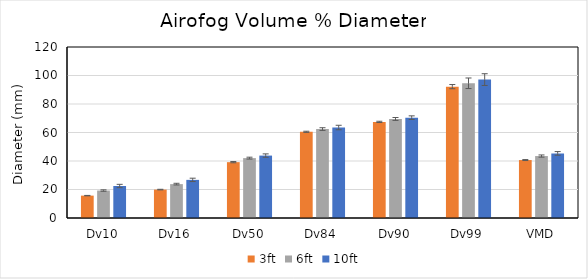
| Category | 3ft | 6ft | 10ft |
|---|---|---|---|
| Dv10 | 15.704 | 19.266 | 22.466 |
| Dv16 | 19.94 | 23.772 | 26.754 |
| Dv50 | 39.188 | 42.028 | 43.798 |
| Dv84 | 60.486 | 62.408 | 63.492 |
| Dv90 | 67.442 | 69.506 | 70.396 |
| Dv99 | 92.18 | 94.548 | 97.126 |
| VMD | 40.666 | 43.47 | 45.338 |